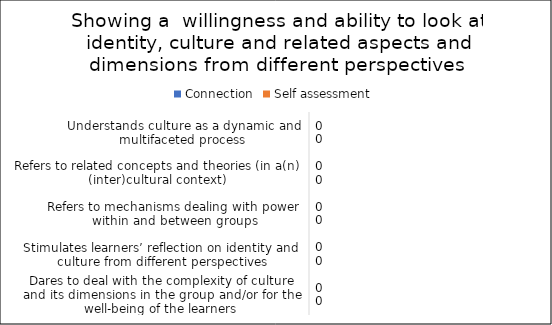
| Category | Connection | Self assessment |
|---|---|---|
| Understands culture as a dynamic and multifaceted process  | 0 | 0 |
| Refers to related concepts and theories (in a(n) (inter)cultural context) | 0 | 0 |
| Refers to mechanisms dealing with power within and between groups | 0 | 0 |
| Stimulates learners’ reflection on identity and culture from different perspectives | 0 | 0 |
| Dares to deal with the complexity of culture and its dimensions in the group and/or for the well-being of the learners | 0 | 0 |